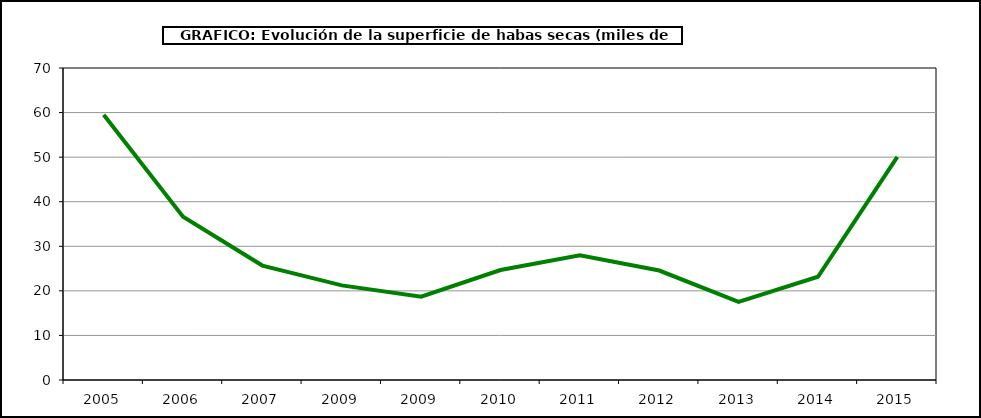
| Category | Superficie |
|---|---|
| 2005.0 | 59.515 |
| 2006.0 | 36.641 |
| 2007.0 | 25.672 |
| 2009.0 | 21.228 |
| 2009.0 | 18.704 |
| 2010.0 | 24.675 |
| 2011.0 | 27.957 |
| 2012.0 | 24.564 |
| 2013.0 | 17.542 |
| 2014.0 | 23.165 |
| 2015.0 | 50.072 |